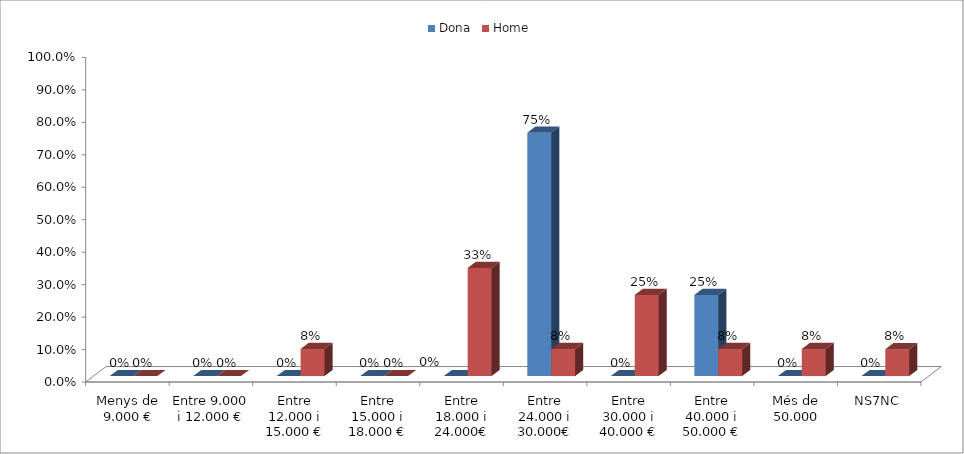
| Category | Dona | Home |
|---|---|---|
| Menys de 9.000 € | 0 | 0 |
| Entre 9.000 i 12.000 € | 0 | 0 |
| Entre 12.000 i 15.000 € | 0 | 0.083 |
| Entre 15.000 i 18.000 € | 0 | 0 |
| Entre 18.000 i 24.000€ | 0 | 0.333 |
| Entre 24.000 i 30.000€ | 0.75 | 0.083 |
| Entre 30.000 i 40.000 € | 0 | 0.25 |
| Entre 40.000 i 50.000 € | 0.25 | 0.083 |
| Més de 50.000 | 0 | 0.083 |
| NS7NC | 0 | 0.083 |